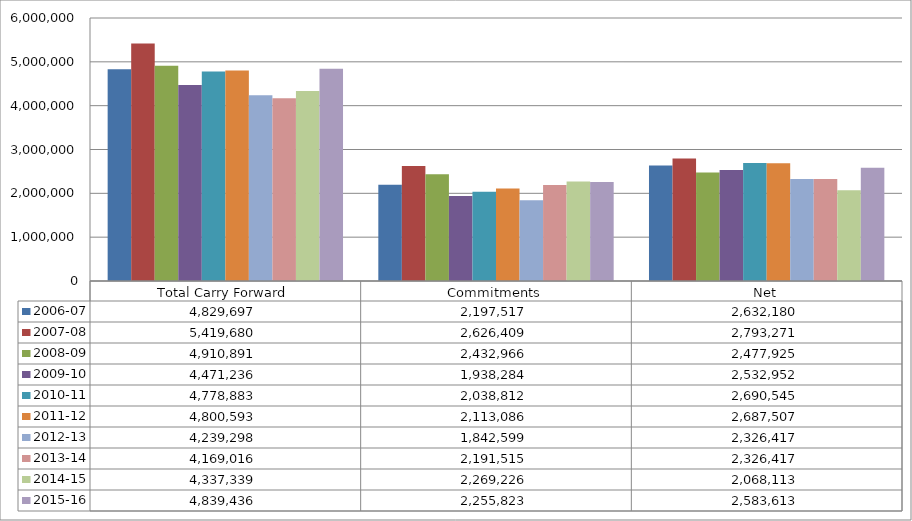
| Category | 2006-07 | 2007-08 | 2008-09 | 2009-10 | 2010-11 | 2011-12 | 2012-13 | 2013-14 | 2014-15 | 2015-16 |
|---|---|---|---|---|---|---|---|---|---|---|
| Total Carry Forward | 4829697.48 | 5419680 | 4910890.65 | 4471235.83 | 4778883 | 4800593 | 4239298 | 4169016 | 4337338.6 | 4839435.72 |
| Commitments | 2197517.23 | 2626409 | 2432966 | 1938284 | 2038812 | 2113086 | 1842599 | 2191515 | 2269225.75 | 2255822.66 |
| Net | 2632180.25 | 2793271 | 2477924.65 | 2532951.83 | 2690545 | 2687507 | 2326417 | 2326417 | 2068112.85 | 2583613.06 |